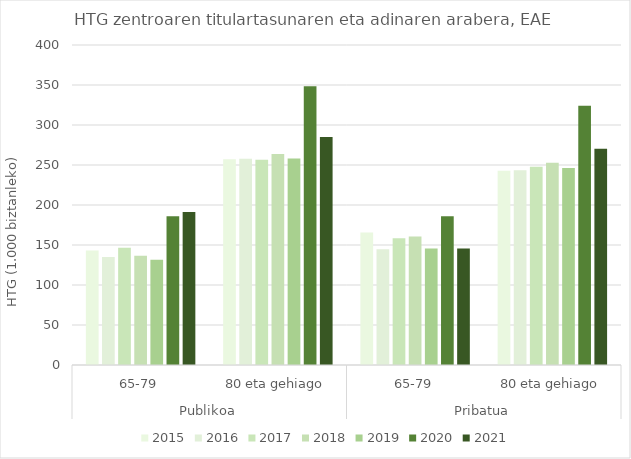
| Category | 2015 | 2016 | 2017 | 2018 | 2019 | 2020 | 2021 |
|---|---|---|---|---|---|---|---|
| 0 | 142.98 | 134.917 | 146.588 | 136.439 | 131.631 | 185.874 | 191.212 |
| 1 | 257.127 | 257.819 | 256.41 | 263.683 | 257.978 | 348.475 | 284.87 |
| 2 | 165.719 | 144.674 | 158.445 | 160.657 | 145.493 | 186.063 | 145.523 |
| 3 | 242.688 | 243.442 | 247.773 | 252.709 | 246.37 | 323.977 | 270.225 |